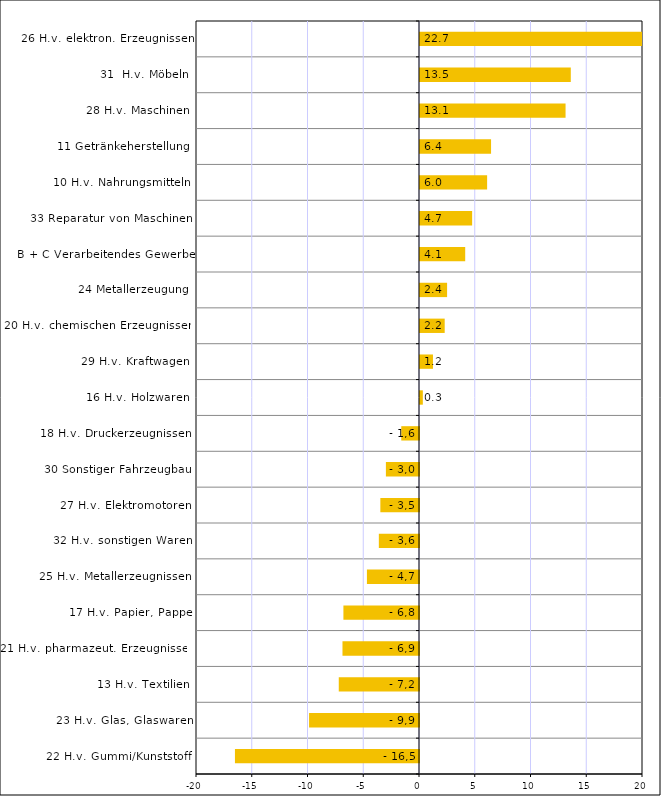
| Category | Series 0 |
|---|---|
| 22 H.v. Gummi/Kunststoff | -16.507 |
| 23 H.v. Glas, Glaswaren | -9.859 |
| 13 H.v. Textilien | -7.196 |
| 21 H.v. pharmazeut. Erzeugnissen | -6.862 |
| 17 H.v. Papier, Pappe | -6.779 |
| 25 H.v. Metallerzeugnissen | -4.671 |
| 32 H.v. sonstigen Waren | -3.602 |
| 27 H.v. Elektromotoren | -3.466 |
| 30 Sonstiger Fahrzeugbau | -2.969 |
| 18 H.v. Druckerzeugnissen | -1.589 |
| 16 H.v. Holzwaren | 0.254 |
| 29 H.v. Kraftwagen | 1.163 |
| 20 H.v. chemischen Erzeugnissen | 2.215 |
| 24 Metallerzeugung | 2.43 |
| B + C Verarbeitendes Gewerbe | 4.054 |
| 33 Reparatur von Maschinen | 4.676 |
| 10 H.v. Nahrungsmitteln | 6.02 |
| 11 Getränkeherstellung | 6.373 |
| 28 H.v. Maschinen | 13.055 |
| 31  H.v. Möbeln | 13.524 |
| 26 H.v. elektron. Erzeugnissen | 22.693 |